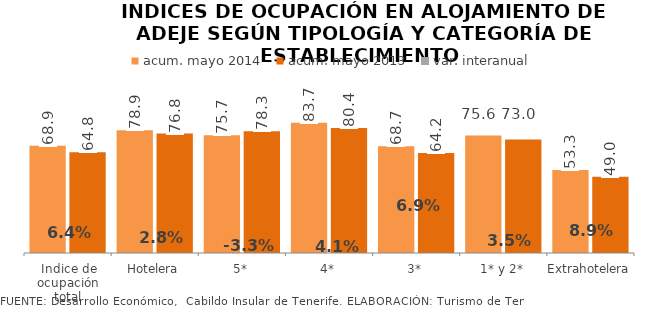
| Category | acum. mayo 2014 | acum. mayo 2013 |
|---|---|---|
| Indice de ocupación total | 68.94 | 64.772 |
| Hotelera | 78.929 | 76.778 |
| 5* | 75.663 | 78.251 |
| 4* | 83.747 | 80.416 |
| 3* | 68.659 | 64.23 |
| 1* y 2* | 75.608 | 73.038 |
| Extrahotelera | 53.348 | 48.991 |